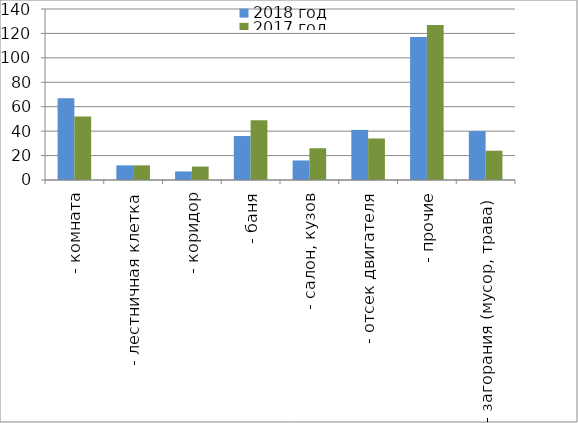
| Category | 2018 год | 2017 год |
|---|---|---|
|  - комната | 67 | 52 |
|  - лестничная клетка | 12 | 12 |
|  - коридор | 7 | 11 |
|  - баня | 36 | 49 |
|  - салон, кузов | 16 | 26 |
|  - отсек двигателя | 41 | 34 |
| - прочие | 117 | 127 |
| - загорания (мусор, трава)  | 40 | 24 |